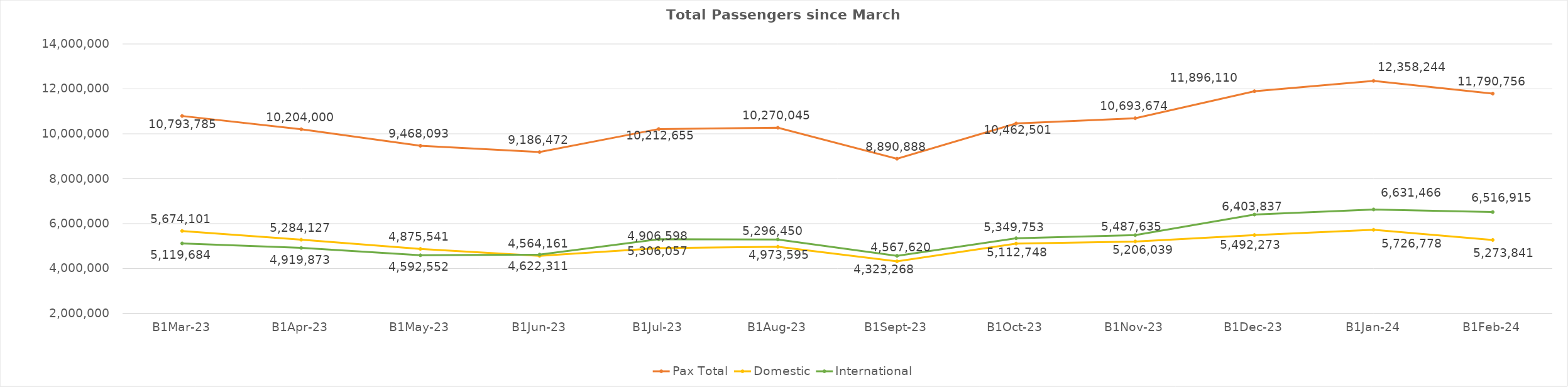
| Category | Pax Total | Domestic | International |
|---|---|---|---|
| 2023-03-01 | 10793785 | 5674101 | 5119684 |
| 2023-04-01 | 10204000 | 5284127 | 4919873 |
| 2023-05-01 | 9468093 | 4875541 | 4592552 |
| 2023-06-01 | 9186472 | 4564161 | 4622311 |
| 2023-07-01 | 10212655 | 4906598 | 5306057 |
| 2023-08-01 | 10270045 | 4973595 | 5296450 |
| 2023-09-01 | 8890888 | 4323268 | 4567620 |
| 2023-10-01 | 10462501 | 5112748 | 5349753 |
| 2023-11-01 | 10693674 | 5206039 | 5487635 |
| 2023-12-01 | 11896110 | 5492273 | 6403837 |
| 2024-01-01 | 12358244 | 5726778 | 6631466 |
| 2024-02-01 | 11790756 | 5273841 | 6516915 |